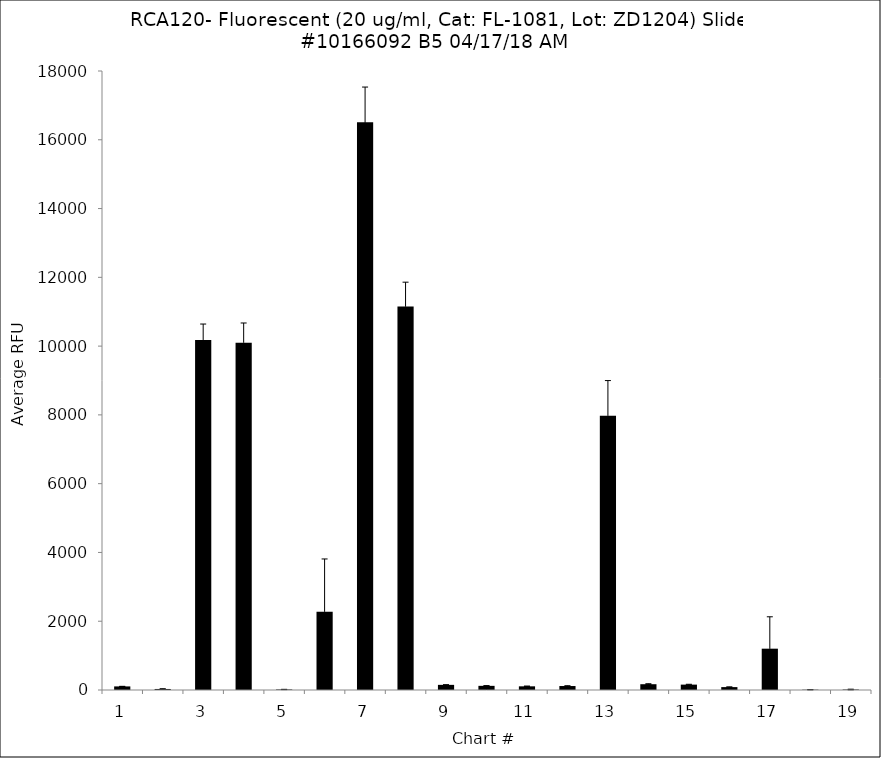
| Category | Series 0 |
|---|---|
| 1.0 | 104.25 |
| 2.0 | 30 |
| 3.0 | 10179.5 |
| 4.0 | 10099.25 |
| 5.0 | 15.25 |
| 6.0 | 2274.5 |
| 7.0 | 16510.25 |
| 8.0 | 11149.5 |
| 9.0 | 149.5 |
| 10.0 | 120.75 |
| 11.0 | 106.75 |
| 12.0 | 115.5 |
| 13.0 | 7977.75 |
| 14.0 | 168.25 |
| 15.0 | 156.5 |
| 16.0 | 84.25 |
| 17.0 | 1201.5 |
| 18.0 | 8.75 |
| 19.0 | 14 |